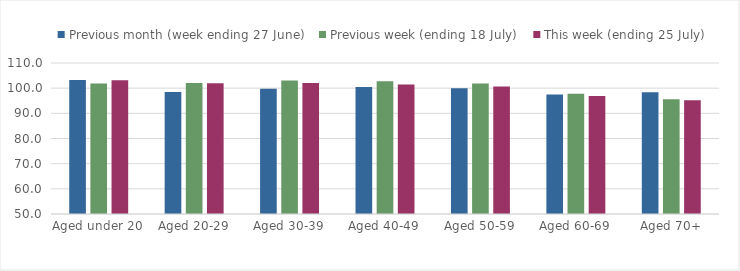
| Category | Previous month (week ending 27 June) | Previous week (ending 18 July) | This week (ending 25 July) |
|---|---|---|---|
| Aged under 20 | 103.257 | 101.846 | 103.107 |
| Aged 20-29 | 98.488 | 102.061 | 102 |
| Aged 30-39 | 99.795 | 103.036 | 102.035 |
| Aged 40-49 | 100.513 | 102.702 | 101.48 |
| Aged 50-59 | 99.996 | 101.897 | 100.671 |
| Aged 60-69 | 97.443 | 97.74 | 96.849 |
| Aged 70+ | 98.379 | 95.624 | 95.222 |